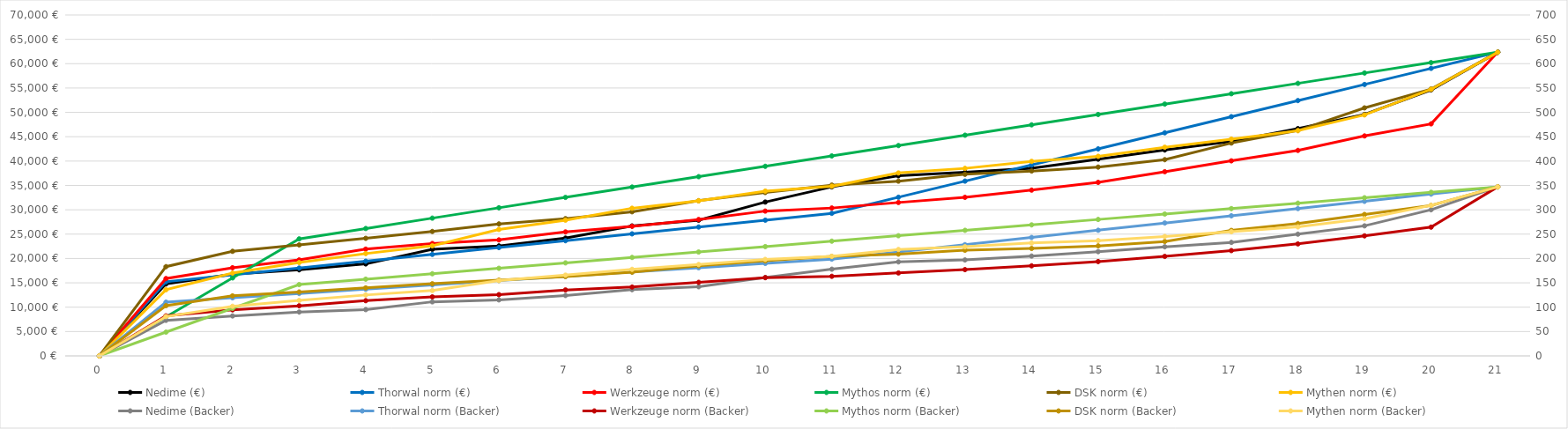
| Category | Nedime (€) | Thorwal norm (€) | Werkzeuge norm (€) | Mythos norm (€) | DSK norm (€) | Mythen norm (€) |
|---|---|---|---|---|---|---|
| 0.0 | 0 | 0 | 0 | 0 | 0 | 0 |
| 1.0 | 14771 | 15220.89 | 15879.347 | 8008.081 | 18321.784 | 13585.517 |
| 2.0 | 16764 | 16625.895 | 18103.852 | 16016.162 | 21471.045 | 16993.673 |
| 3.0 | 17674 | 18030.901 | 19704.692 | 24024.243 | 22786.718 | 19168.104 |
| 4.0 | 18881 | 19435.906 | 21920.789 | 26153.174 | 24137.624 | 21005.875 |
| 5.0 | 21886 | 20840.911 | 23073.071 | 28282.105 | 25549.934 | 22597.041 |
| 6.0 | 22571 | 22245.916 | 23816.279 | 30411.036 | 27093.107 | 25963.633 |
| 7.0 | 24180 | 23650.922 | 25452.213 | 32539.967 | 28176.248 | 27863.056 |
| 8.0 | 26679 | 25055.927 | 26607.421 | 34668.898 | 29592.585 | 30317.344 |
| 9.0 | 27868 | 26460.932 | 28001.712 | 36797.829 | 31860.032 | 31844.779 |
| 10.0 | 31587 | 27865.937 | 29730.867 | 38926.76 | 33546.148 | 33841.183 |
| 11.0 | 34703 | 29270.942 | 30365.134 | 41055.691 | 35065.162 | 34832.457 |
| 12.0 | 36986 | 32578.348 | 31495.483 | 43184.622 | 35879.53 | 37557.596 |
| 13.0 | 37704 | 35885.754 | 32558.566 | 45313.553 | 37285.298 | 38504.537 |
| 14.0 | 38541 | 39193.16 | 34038.035 | 47442.483 | 37955.717 | 39940.534 |
| 15.0 | 40401 | 42500.565 | 35630.832 | 49571.414 | 38763.543 | 40976.835 |
| 16.0 | 42277 | 45807.971 | 37819.146 | 51700.345 | 40290.106 | 42838.852 |
| 17.0 | 44039 | 49115.377 | 40047.307 | 53829.276 | 43704.616 | 44512.45 |
| 18.0 | 46661 | 52422.783 | 42194.31 | 55958.207 | 46292.174 | 46238.002 |
| 19.0 | 49576 | 55730.188 | 45163.486 | 58087.138 | 50920.687 | 49482.677 |
| 20.0 | 54612 | 59037.594 | 47642.794 | 60216.069 | 54792.209 | 54719.599 |
| 21.0 | 62345 | 62345 | 62345 | 62345 | 62345 | 62345 |